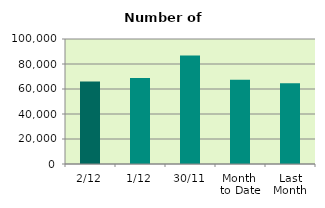
| Category | Series 0 |
|---|---|
| 2/12 | 65952 |
| 1/12 | 68766 |
| 30/11 | 86856 |
| Month 
to Date | 67359 |
| Last
Month | 64659.273 |